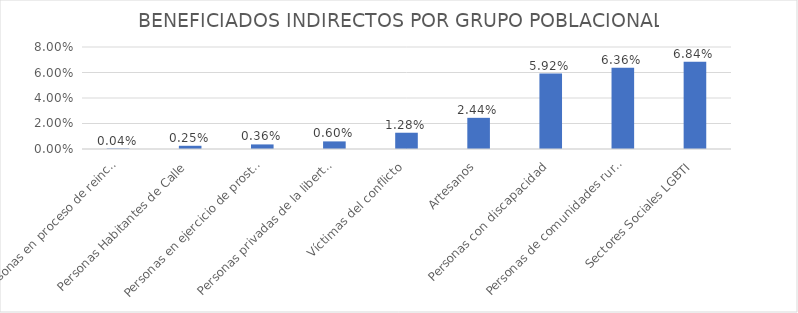
| Category | % |
|---|---|
| Personas en proceso de reincorporación | 0 |
| Personas Habitantes de Calle | 0.003 |
| Personas en ejercicio de prostitución | 0.004 |
| Personas privadas de la libertad | 0.006 |
| Víctimas del conflicto | 0.013 |
| Artesanos | 0.024 |
| Personas con discapacidad | 0.059 |
| Personas de comunidades rurales y campesinas | 0.064 |
| Sectores Sociales LGBTI | 0.068 |